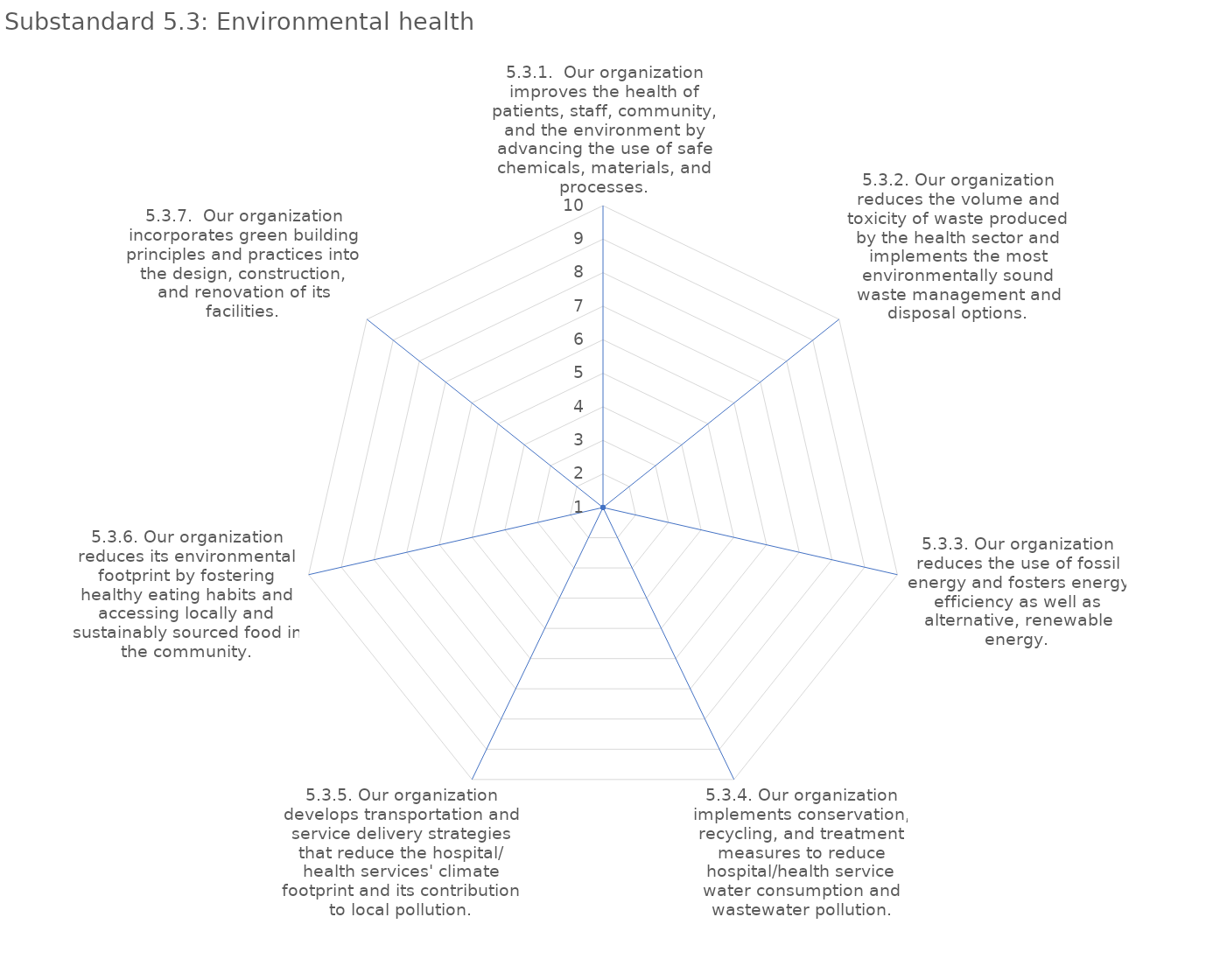
| Category | value |
|---|---|
| 5.3.1.  Our organization improves the health of patients, staff, community, and the environment by advancing the use of safe chemicals, materials, and processes. | 1 |
| 5.3.2. Our organization reduces the volume and toxicity of waste produced by the health sector and implements the most environmentally sound waste management and disposal options. | 1 |
| 5.3.3. Our organization reduces the use of fossil energy and fosters energy efficiency as well as alternative, renewable energy. | 1 |
| 5.3.4. Our organization implements conservation, recycling, and treatment measures to reduce hospital/health service water consumption and wastewater pollution. | 1 |
| 5.3.5. Our organization develops transportation and service delivery strategies that reduce the hospital/ health services' climate footprint and its contribution to local pollution. | 1 |
| 5.3.6. Our organization reduces its environmental footprint by fostering healthy eating habits and accessing locally and sustainably sourced food in the community. | 1 |
| 5.3.7.  Our organization incorporates green building principles and practices into the design, construction, and renovation of its facilities. | 1 |